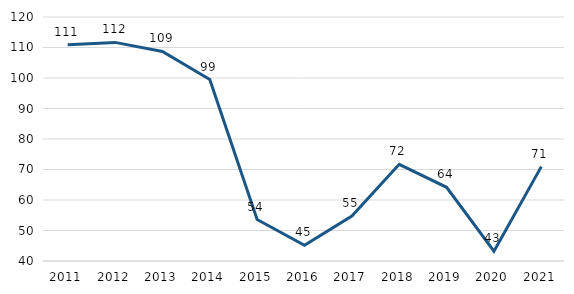
| Category | Preço Barril Média Anual USD |
|---|---|
| 2011.0 | 110.914 |
| 2012.0 | 111.675 |
| 2013.0 | 108.705 |
| 2014.0 | 99.494 |
| 2015.0 | 53.598 |
| 2016.0 | 45.132 |
| 2017.0 | 54.746 |
| 2018.0 | 71.693 |
| 2019.0 | 64.165 |
| 2020.0 | 43.212 |
| 2021.0 | 70.948 |